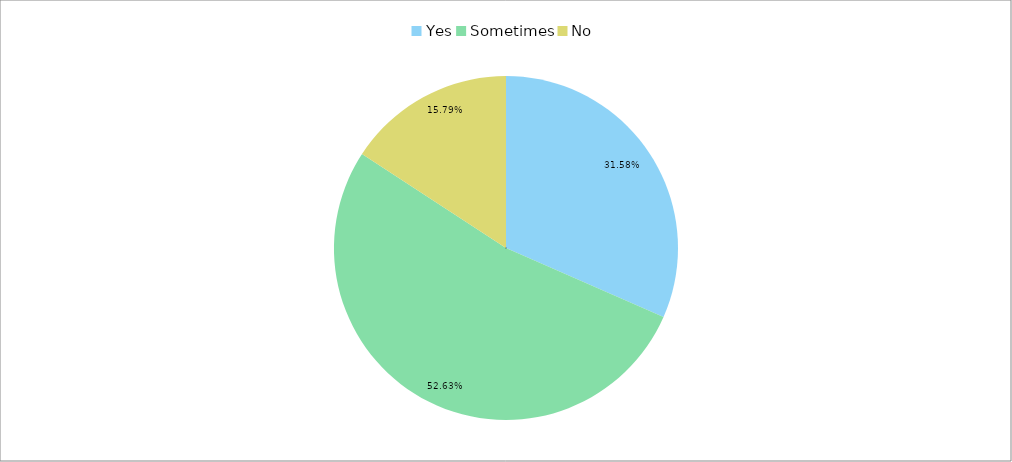
| Category | Total (% & freq col) |
|---|---|
| Yes | 0.316 |
| Sometimes | 0.526 |
| No | 0.158 |